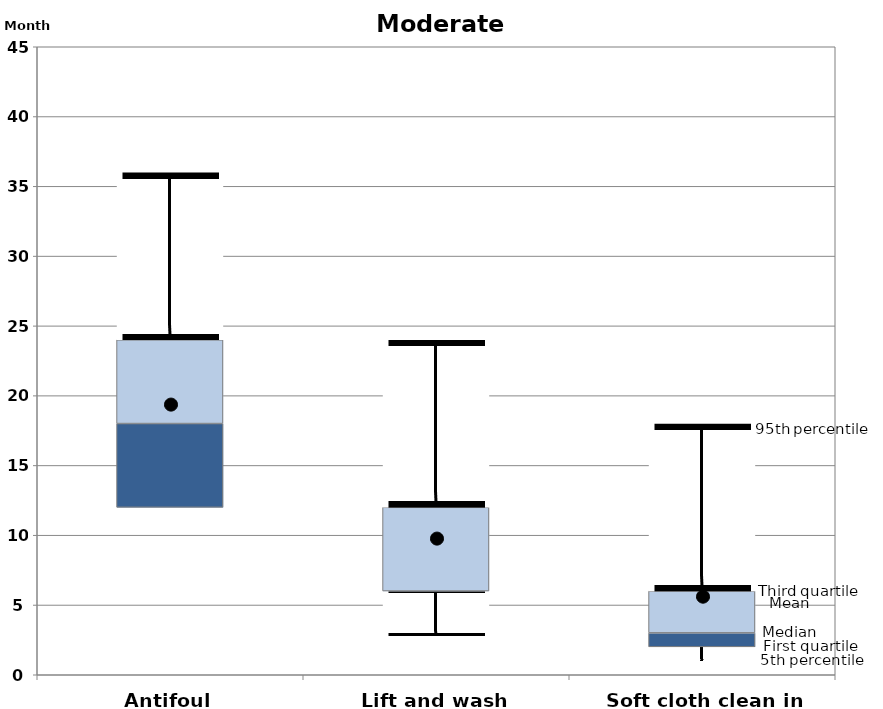
| Category | 5th percentile | First quartile | Second quartile | Third quartile | 95th percentile |
|---|---|---|---|---|---|
| Antifoul | 12 | 0 | 6 | 6 | 12 |
| Lift and wash | 2.8 | 3.2 | 0 | 6 | 12 |
| Soft cloth clean in water | 1 | 1 | 1 | 3 | 12 |